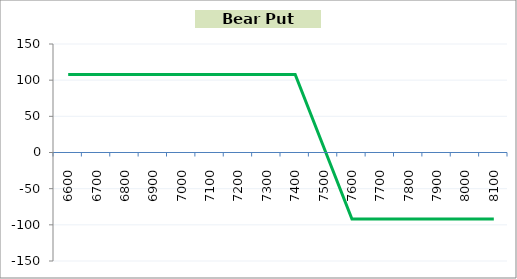
| Category | Series 1 |
|---|---|
| 6600.0 | 108 |
| 6700.0 | 108 |
| 6800.0 | 108 |
| 6900.0 | 108 |
| 7000.0 | 108 |
| 7100.0 | 108 |
| 7200.0 | 108 |
| 7300.0 | 108 |
| 7400.0 | 108 |
| 7500.0 | 8 |
| 7600.0 | -92 |
| 7700.0 | -92 |
| 7800.0 | -92 |
| 7900.0 | -92 |
| 8000.0 | -92 |
| 8100.0 | -92 |